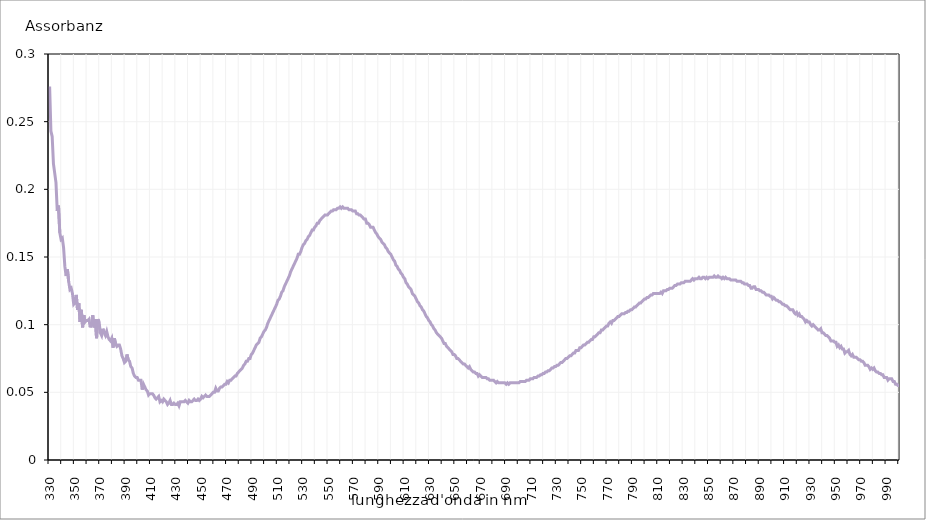
| Category | Series 0 |
|---|---|
| 330.0 | 0.276 |
| 331.0 | 0.243 |
| 332.0 | 0.239 |
| 333.0 | 0.219 |
| 334.0 | 0.212 |
| 335.0 | 0.205 |
| 336.0 | 0.184 |
| 337.0 | 0.188 |
| 338.0 | 0.168 |
| 339.0 | 0.163 |
| 340.0 | 0.164 |
| 341.0 | 0.157 |
| 342.0 | 0.143 |
| 343.0 | 0.136 |
| 344.0 | 0.141 |
| 345.0 | 0.132 |
| 346.0 | 0.126 |
| 347.0 | 0.127 |
| 348.0 | 0.123 |
| 349.0 | 0.115 |
| 350.0 | 0.116 |
| 351.0 | 0.122 |
| 352.0 | 0.111 |
| 353.0 | 0.116 |
| 354.0 | 0.102 |
| 355.0 | 0.111 |
| 356.0 | 0.098 |
| 357.0 | 0.107 |
| 358.0 | 0.102 |
| 359.0 | 0.103 |
| 360.0 | 0.103 |
| 361.0 | 0.104 |
| 362.0 | 0.098 |
| 363.0 | 0.101 |
| 364.0 | 0.107 |
| 365.0 | 0.098 |
| 366.0 | 0.104 |
| 367.0 | 0.09 |
| 368.0 | 0.104 |
| 369.0 | 0.102 |
| 370.0 | 0.094 |
| 371.0 | 0.092 |
| 372.0 | 0.097 |
| 373.0 | 0.094 |
| 374.0 | 0.092 |
| 375.0 | 0.095 |
| 376.0 | 0.091 |
| 377.0 | 0.089 |
| 378.0 | 0.088 |
| 379.0 | 0.09 |
| 380.0 | 0.083 |
| 381.0 | 0.09 |
| 382.0 | 0.086 |
| 383.0 | 0.084 |
| 384.0 | 0.085 |
| 385.0 | 0.085 |
| 386.0 | 0.082 |
| 387.0 | 0.077 |
| 388.0 | 0.075 |
| 389.0 | 0.072 |
| 390.0 | 0.073 |
| 391.0 | 0.078 |
| 392.0 | 0.074 |
| 393.0 | 0.073 |
| 394.0 | 0.069 |
| 395.0 | 0.068 |
| 396.0 | 0.064 |
| 397.0 | 0.062 |
| 398.0 | 0.061 |
| 399.0 | 0.061 |
| 400.0 | 0.059 |
| 401.0 | 0.059 |
| 402.0 | 0.059 |
| 403.0 | 0.052 |
| 404.0 | 0.056 |
| 405.0 | 0.054 |
| 406.0 | 0.052 |
| 407.0 | 0.051 |
| 408.0 | 0.048 |
| 409.0 | 0.049 |
| 410.0 | 0.049 |
| 411.0 | 0.049 |
| 412.0 | 0.048 |
| 413.0 | 0.046 |
| 414.0 | 0.045 |
| 415.0 | 0.046 |
| 416.0 | 0.047 |
| 417.0 | 0.043 |
| 418.0 | 0.044 |
| 419.0 | 0.043 |
| 420.0 | 0.045 |
| 421.0 | 0.044 |
| 422.0 | 0.043 |
| 423.0 | 0.041 |
| 424.0 | 0.042 |
| 425.0 | 0.044 |
| 426.0 | 0.041 |
| 427.0 | 0.041 |
| 428.0 | 0.042 |
| 429.0 | 0.041 |
| 430.0 | 0.041 |
| 431.0 | 0.042 |
| 432.0 | 0.04 |
| 433.0 | 0.043 |
| 434.0 | 0.043 |
| 435.0 | 0.043 |
| 436.0 | 0.043 |
| 437.0 | 0.044 |
| 438.0 | 0.043 |
| 439.0 | 0.042 |
| 440.0 | 0.044 |
| 441.0 | 0.043 |
| 442.0 | 0.043 |
| 443.0 | 0.044 |
| 444.0 | 0.045 |
| 445.0 | 0.044 |
| 446.0 | 0.044 |
| 447.0 | 0.045 |
| 448.0 | 0.044 |
| 449.0 | 0.045 |
| 450.0 | 0.047 |
| 451.0 | 0.046 |
| 452.0 | 0.047 |
| 453.0 | 0.048 |
| 454.0 | 0.047 |
| 455.0 | 0.047 |
| 456.0 | 0.047 |
| 457.0 | 0.048 |
| 458.0 | 0.049 |
| 459.0 | 0.05 |
| 460.0 | 0.05 |
| 461.0 | 0.053 |
| 462.0 | 0.051 |
| 463.0 | 0.051 |
| 464.0 | 0.053 |
| 465.0 | 0.054 |
| 466.0 | 0.054 |
| 467.0 | 0.055 |
| 468.0 | 0.056 |
| 469.0 | 0.056 |
| 470.0 | 0.058 |
| 471.0 | 0.057 |
| 472.0 | 0.059 |
| 473.0 | 0.059 |
| 474.0 | 0.06 |
| 475.0 | 0.061 |
| 476.0 | 0.062 |
| 477.0 | 0.062 |
| 478.0 | 0.064 |
| 479.0 | 0.065 |
| 480.0 | 0.066 |
| 481.0 | 0.067 |
| 482.0 | 0.068 |
| 483.0 | 0.07 |
| 484.0 | 0.071 |
| 485.0 | 0.073 |
| 486.0 | 0.073 |
| 487.0 | 0.075 |
| 488.0 | 0.075 |
| 489.0 | 0.078 |
| 490.0 | 0.079 |
| 491.0 | 0.081 |
| 492.0 | 0.083 |
| 493.0 | 0.085 |
| 494.0 | 0.086 |
| 495.0 | 0.087 |
| 496.0 | 0.09 |
| 497.0 | 0.091 |
| 498.0 | 0.093 |
| 499.0 | 0.095 |
| 500.0 | 0.096 |
| 501.0 | 0.098 |
| 502.0 | 0.101 |
| 503.0 | 0.103 |
| 504.0 | 0.105 |
| 505.0 | 0.107 |
| 506.0 | 0.109 |
| 507.0 | 0.111 |
| 508.0 | 0.113 |
| 509.0 | 0.115 |
| 510.0 | 0.118 |
| 511.0 | 0.119 |
| 512.0 | 0.121 |
| 513.0 | 0.124 |
| 514.0 | 0.125 |
| 515.0 | 0.128 |
| 516.0 | 0.13 |
| 517.0 | 0.132 |
| 518.0 | 0.134 |
| 519.0 | 0.136 |
| 520.0 | 0.139 |
| 521.0 | 0.141 |
| 522.0 | 0.143 |
| 523.0 | 0.145 |
| 524.0 | 0.147 |
| 525.0 | 0.149 |
| 526.0 | 0.152 |
| 527.0 | 0.152 |
| 528.0 | 0.154 |
| 529.0 | 0.157 |
| 530.0 | 0.159 |
| 531.0 | 0.16 |
| 532.0 | 0.162 |
| 533.0 | 0.163 |
| 534.0 | 0.165 |
| 535.0 | 0.166 |
| 536.0 | 0.168 |
| 537.0 | 0.17 |
| 538.0 | 0.17 |
| 539.0 | 0.172 |
| 540.0 | 0.173 |
| 541.0 | 0.175 |
| 542.0 | 0.175 |
| 543.0 | 0.177 |
| 544.0 | 0.178 |
| 545.0 | 0.179 |
| 546.0 | 0.18 |
| 547.0 | 0.181 |
| 548.0 | 0.181 |
| 549.0 | 0.181 |
| 550.0 | 0.182 |
| 551.0 | 0.183 |
| 552.0 | 0.184 |
| 553.0 | 0.184 |
| 554.0 | 0.185 |
| 555.0 | 0.185 |
| 556.0 | 0.185 |
| 557.0 | 0.186 |
| 558.0 | 0.186 |
| 559.0 | 0.187 |
| 560.0 | 0.186 |
| 561.0 | 0.187 |
| 562.0 | 0.186 |
| 563.0 | 0.186 |
| 564.0 | 0.186 |
| 565.0 | 0.186 |
| 566.0 | 0.185 |
| 567.0 | 0.185 |
| 568.0 | 0.185 |
| 569.0 | 0.184 |
| 570.0 | 0.184 |
| 571.0 | 0.184 |
| 572.0 | 0.182 |
| 573.0 | 0.182 |
| 574.0 | 0.181 |
| 575.0 | 0.181 |
| 576.0 | 0.18 |
| 577.0 | 0.179 |
| 578.0 | 0.178 |
| 579.0 | 0.178 |
| 580.0 | 0.175 |
| 581.0 | 0.175 |
| 582.0 | 0.174 |
| 583.0 | 0.172 |
| 584.0 | 0.172 |
| 585.0 | 0.172 |
| 586.0 | 0.17 |
| 587.0 | 0.168 |
| 588.0 | 0.167 |
| 589.0 | 0.165 |
| 590.0 | 0.164 |
| 591.0 | 0.163 |
| 592.0 | 0.161 |
| 593.0 | 0.16 |
| 594.0 | 0.159 |
| 595.0 | 0.157 |
| 596.0 | 0.156 |
| 597.0 | 0.154 |
| 598.0 | 0.153 |
| 599.0 | 0.152 |
| 600.0 | 0.15 |
| 601.0 | 0.148 |
| 602.0 | 0.147 |
| 603.0 | 0.144 |
| 604.0 | 0.143 |
| 605.0 | 0.141 |
| 606.0 | 0.14 |
| 607.0 | 0.138 |
| 608.0 | 0.137 |
| 609.0 | 0.135 |
| 610.0 | 0.134 |
| 611.0 | 0.131 |
| 612.0 | 0.13 |
| 613.0 | 0.128 |
| 614.0 | 0.127 |
| 615.0 | 0.126 |
| 616.0 | 0.123 |
| 617.0 | 0.122 |
| 618.0 | 0.121 |
| 619.0 | 0.119 |
| 620.0 | 0.117 |
| 621.0 | 0.116 |
| 622.0 | 0.114 |
| 623.0 | 0.113 |
| 624.0 | 0.111 |
| 625.0 | 0.11 |
| 626.0 | 0.108 |
| 627.0 | 0.106 |
| 628.0 | 0.105 |
| 629.0 | 0.103 |
| 630.0 | 0.102 |
| 631.0 | 0.1 |
| 632.0 | 0.099 |
| 633.0 | 0.097 |
| 634.0 | 0.096 |
| 635.0 | 0.094 |
| 636.0 | 0.093 |
| 637.0 | 0.092 |
| 638.0 | 0.091 |
| 639.0 | 0.09 |
| 640.0 | 0.088 |
| 641.0 | 0.086 |
| 642.0 | 0.086 |
| 643.0 | 0.084 |
| 644.0 | 0.083 |
| 645.0 | 0.082 |
| 646.0 | 0.081 |
| 647.0 | 0.08 |
| 648.0 | 0.078 |
| 649.0 | 0.078 |
| 650.0 | 0.077 |
| 651.0 | 0.075 |
| 652.0 | 0.075 |
| 653.0 | 0.074 |
| 654.0 | 0.073 |
| 655.0 | 0.072 |
| 656.0 | 0.071 |
| 657.0 | 0.071 |
| 658.0 | 0.07 |
| 659.0 | 0.069 |
| 660.0 | 0.068 |
| 661.0 | 0.069 |
| 662.0 | 0.067 |
| 663.0 | 0.066 |
| 664.0 | 0.065 |
| 665.0 | 0.065 |
| 666.0 | 0.064 |
| 667.0 | 0.064 |
| 668.0 | 0.062 |
| 669.0 | 0.063 |
| 670.0 | 0.062 |
| 671.0 | 0.061 |
| 672.0 | 0.061 |
| 673.0 | 0.061 |
| 674.0 | 0.061 |
| 675.0 | 0.06 |
| 676.0 | 0.06 |
| 677.0 | 0.059 |
| 678.0 | 0.059 |
| 679.0 | 0.059 |
| 680.0 | 0.059 |
| 681.0 | 0.058 |
| 682.0 | 0.057 |
| 683.0 | 0.058 |
| 684.0 | 0.057 |
| 685.0 | 0.057 |
| 686.0 | 0.057 |
| 687.0 | 0.057 |
| 688.0 | 0.057 |
| 689.0 | 0.057 |
| 690.0 | 0.056 |
| 691.0 | 0.057 |
| 692.0 | 0.056 |
| 693.0 | 0.057 |
| 694.0 | 0.057 |
| 695.0 | 0.057 |
| 696.0 | 0.057 |
| 697.0 | 0.057 |
| 698.0 | 0.057 |
| 699.0 | 0.057 |
| 700.0 | 0.057 |
| 701.0 | 0.058 |
| 702.0 | 0.058 |
| 703.0 | 0.058 |
| 704.0 | 0.058 |
| 705.0 | 0.058 |
| 706.0 | 0.059 |
| 707.0 | 0.059 |
| 708.0 | 0.059 |
| 709.0 | 0.06 |
| 710.0 | 0.06 |
| 711.0 | 0.06 |
| 712.0 | 0.061 |
| 713.0 | 0.061 |
| 714.0 | 0.061 |
| 715.0 | 0.062 |
| 716.0 | 0.062 |
| 717.0 | 0.063 |
| 718.0 | 0.063 |
| 719.0 | 0.064 |
| 720.0 | 0.064 |
| 721.0 | 0.065 |
| 722.0 | 0.065 |
| 723.0 | 0.066 |
| 724.0 | 0.066 |
| 725.0 | 0.067 |
| 726.0 | 0.068 |
| 727.0 | 0.068 |
| 728.0 | 0.069 |
| 729.0 | 0.069 |
| 730.0 | 0.07 |
| 731.0 | 0.07 |
| 732.0 | 0.071 |
| 733.0 | 0.072 |
| 734.0 | 0.072 |
| 735.0 | 0.073 |
| 736.0 | 0.074 |
| 737.0 | 0.075 |
| 738.0 | 0.075 |
| 739.0 | 0.076 |
| 740.0 | 0.077 |
| 741.0 | 0.077 |
| 742.0 | 0.078 |
| 743.0 | 0.079 |
| 744.0 | 0.079 |
| 745.0 | 0.081 |
| 746.0 | 0.081 |
| 747.0 | 0.081 |
| 748.0 | 0.083 |
| 749.0 | 0.083 |
| 750.0 | 0.084 |
| 751.0 | 0.085 |
| 752.0 | 0.085 |
| 753.0 | 0.086 |
| 754.0 | 0.087 |
| 755.0 | 0.087 |
| 756.0 | 0.088 |
| 757.0 | 0.089 |
| 758.0 | 0.089 |
| 759.0 | 0.091 |
| 760.0 | 0.091 |
| 761.0 | 0.092 |
| 762.0 | 0.093 |
| 763.0 | 0.094 |
| 764.0 | 0.094 |
| 765.0 | 0.096 |
| 766.0 | 0.096 |
| 767.0 | 0.097 |
| 768.0 | 0.098 |
| 769.0 | 0.099 |
| 770.0 | 0.099 |
| 771.0 | 0.101 |
| 772.0 | 0.102 |
| 773.0 | 0.101 |
| 774.0 | 0.103 |
| 775.0 | 0.103 |
| 776.0 | 0.104 |
| 777.0 | 0.105 |
| 778.0 | 0.106 |
| 779.0 | 0.106 |
| 780.0 | 0.107 |
| 781.0 | 0.108 |
| 782.0 | 0.108 |
| 783.0 | 0.108 |
| 784.0 | 0.109 |
| 785.0 | 0.109 |
| 786.0 | 0.11 |
| 787.0 | 0.11 |
| 788.0 | 0.111 |
| 789.0 | 0.111 |
| 790.0 | 0.112 |
| 791.0 | 0.113 |
| 792.0 | 0.113 |
| 793.0 | 0.114 |
| 794.0 | 0.115 |
| 795.0 | 0.116 |
| 796.0 | 0.116 |
| 797.0 | 0.117 |
| 798.0 | 0.118 |
| 799.0 | 0.119 |
| 800.0 | 0.119 |
| 801.0 | 0.12 |
| 802.0 | 0.12 |
| 803.0 | 0.121 |
| 804.0 | 0.122 |
| 805.0 | 0.122 |
| 806.0 | 0.123 |
| 807.0 | 0.123 |
| 808.0 | 0.123 |
| 809.0 | 0.123 |
| 810.0 | 0.123 |
| 811.0 | 0.123 |
| 812.0 | 0.124 |
| 813.0 | 0.123 |
| 814.0 | 0.125 |
| 815.0 | 0.125 |
| 816.0 | 0.125 |
| 817.0 | 0.126 |
| 818.0 | 0.126 |
| 819.0 | 0.127 |
| 820.0 | 0.127 |
| 821.0 | 0.127 |
| 822.0 | 0.128 |
| 823.0 | 0.129 |
| 824.0 | 0.129 |
| 825.0 | 0.13 |
| 826.0 | 0.13 |
| 827.0 | 0.13 |
| 828.0 | 0.131 |
| 829.0 | 0.131 |
| 830.0 | 0.131 |
| 831.0 | 0.132 |
| 832.0 | 0.132 |
| 833.0 | 0.132 |
| 834.0 | 0.132 |
| 835.0 | 0.132 |
| 836.0 | 0.133 |
| 837.0 | 0.134 |
| 838.0 | 0.133 |
| 839.0 | 0.134 |
| 840.0 | 0.134 |
| 841.0 | 0.134 |
| 842.0 | 0.135 |
| 843.0 | 0.134 |
| 844.0 | 0.134 |
| 845.0 | 0.135 |
| 846.0 | 0.135 |
| 847.0 | 0.134 |
| 848.0 | 0.135 |
| 849.0 | 0.134 |
| 850.0 | 0.135 |
| 851.0 | 0.135 |
| 852.0 | 0.135 |
| 853.0 | 0.135 |
| 854.0 | 0.136 |
| 855.0 | 0.135 |
| 856.0 | 0.135 |
| 857.0 | 0.136 |
| 858.0 | 0.135 |
| 859.0 | 0.135 |
| 860.0 | 0.134 |
| 861.0 | 0.135 |
| 862.0 | 0.134 |
| 863.0 | 0.135 |
| 864.0 | 0.134 |
| 865.0 | 0.134 |
| 866.0 | 0.134 |
| 867.0 | 0.133 |
| 868.0 | 0.133 |
| 869.0 | 0.133 |
| 870.0 | 0.133 |
| 871.0 | 0.133 |
| 872.0 | 0.132 |
| 873.0 | 0.132 |
| 874.0 | 0.132 |
| 875.0 | 0.132 |
| 876.0 | 0.131 |
| 877.0 | 0.131 |
| 878.0 | 0.13 |
| 879.0 | 0.13 |
| 880.0 | 0.13 |
| 881.0 | 0.129 |
| 882.0 | 0.129 |
| 883.0 | 0.127 |
| 884.0 | 0.127 |
| 885.0 | 0.128 |
| 886.0 | 0.128 |
| 887.0 | 0.126 |
| 888.0 | 0.126 |
| 889.0 | 0.126 |
| 890.0 | 0.125 |
| 891.0 | 0.125 |
| 892.0 | 0.124 |
| 893.0 | 0.124 |
| 894.0 | 0.123 |
| 895.0 | 0.122 |
| 896.0 | 0.122 |
| 897.0 | 0.122 |
| 898.0 | 0.121 |
| 899.0 | 0.121 |
| 900.0 | 0.119 |
| 901.0 | 0.12 |
| 902.0 | 0.119 |
| 903.0 | 0.118 |
| 904.0 | 0.118 |
| 905.0 | 0.117 |
| 906.0 | 0.117 |
| 907.0 | 0.116 |
| 908.0 | 0.115 |
| 909.0 | 0.115 |
| 910.0 | 0.114 |
| 911.0 | 0.114 |
| 912.0 | 0.113 |
| 913.0 | 0.112 |
| 914.0 | 0.111 |
| 915.0 | 0.111 |
| 916.0 | 0.111 |
| 917.0 | 0.109 |
| 918.0 | 0.108 |
| 919.0 | 0.109 |
| 920.0 | 0.107 |
| 921.0 | 0.108 |
| 922.0 | 0.106 |
| 923.0 | 0.106 |
| 924.0 | 0.105 |
| 925.0 | 0.104 |
| 926.0 | 0.102 |
| 927.0 | 0.103 |
| 928.0 | 0.102 |
| 929.0 | 0.102 |
| 930.0 | 0.1 |
| 931.0 | 0.099 |
| 932.0 | 0.1 |
| 933.0 | 0.099 |
| 934.0 | 0.098 |
| 935.0 | 0.097 |
| 936.0 | 0.096 |
| 937.0 | 0.096 |
| 938.0 | 0.097 |
| 939.0 | 0.094 |
| 940.0 | 0.094 |
| 941.0 | 0.093 |
| 942.0 | 0.092 |
| 943.0 | 0.092 |
| 944.0 | 0.091 |
| 945.0 | 0.09 |
| 946.0 | 0.088 |
| 947.0 | 0.088 |
| 948.0 | 0.088 |
| 949.0 | 0.087 |
| 950.0 | 0.087 |
| 951.0 | 0.084 |
| 952.0 | 0.085 |
| 953.0 | 0.083 |
| 954.0 | 0.084 |
| 955.0 | 0.082 |
| 956.0 | 0.082 |
| 957.0 | 0.079 |
| 958.0 | 0.08 |
| 959.0 | 0.08 |
| 960.0 | 0.081 |
| 961.0 | 0.078 |
| 962.0 | 0.077 |
| 963.0 | 0.078 |
| 964.0 | 0.076 |
| 965.0 | 0.076 |
| 966.0 | 0.076 |
| 967.0 | 0.075 |
| 968.0 | 0.074 |
| 969.0 | 0.074 |
| 970.0 | 0.073 |
| 971.0 | 0.073 |
| 972.0 | 0.072 |
| 973.0 | 0.07 |
| 974.0 | 0.07 |
| 975.0 | 0.07 |
| 976.0 | 0.069 |
| 977.0 | 0.067 |
| 978.0 | 0.068 |
| 979.0 | 0.067 |
| 980.0 | 0.068 |
| 981.0 | 0.066 |
| 982.0 | 0.065 |
| 983.0 | 0.065 |
| 984.0 | 0.064 |
| 985.0 | 0.064 |
| 986.0 | 0.063 |
| 987.0 | 0.063 |
| 988.0 | 0.061 |
| 989.0 | 0.061 |
| 990.0 | 0.061 |
| 991.0 | 0.059 |
| 992.0 | 0.06 |
| 993.0 | 0.06 |
| 994.0 | 0.06 |
| 995.0 | 0.058 |
| 996.0 | 0.058 |
| 997.0 | 0.056 |
| 998.0 | 0.056 |
| 999.0 | 0.055 |
| 1000.0 | 0.055 |